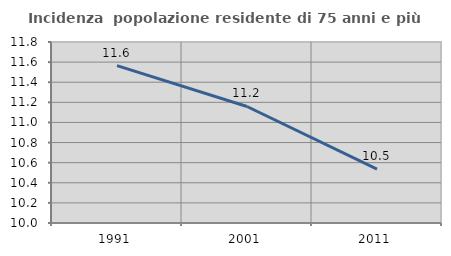
| Category | Incidenza  popolazione residente di 75 anni e più |
|---|---|
| 1991.0 | 11.565 |
| 2001.0 | 11.159 |
| 2011.0 | 10.535 |